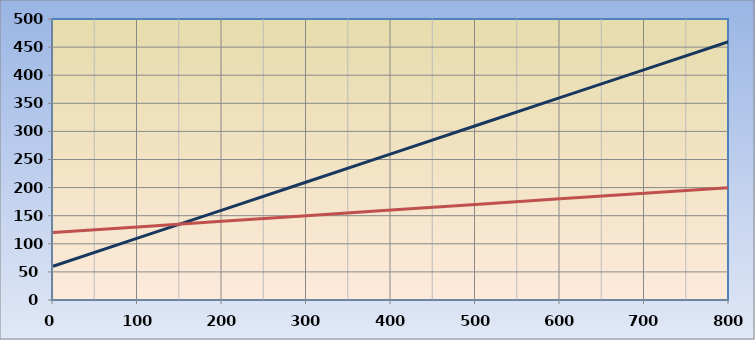
| Category | Series 0 | Series 1 | Series 2 |
|---|---|---|---|
| 0.0 | 60 | 120 |  |
| 100.0 | 110 | 130 |  |
| 200.0 | 160 | 140 |  |
| 300.0 | 210 | 150 |  |
| 400.0 | 260 | 160 |  |
| 500.0 | 310 | 170 |  |
| 600.0 | 360 | 180 |  |
| 700.0 | 410 | 190 |  |
| 800.0 | 460 | 200 |  |